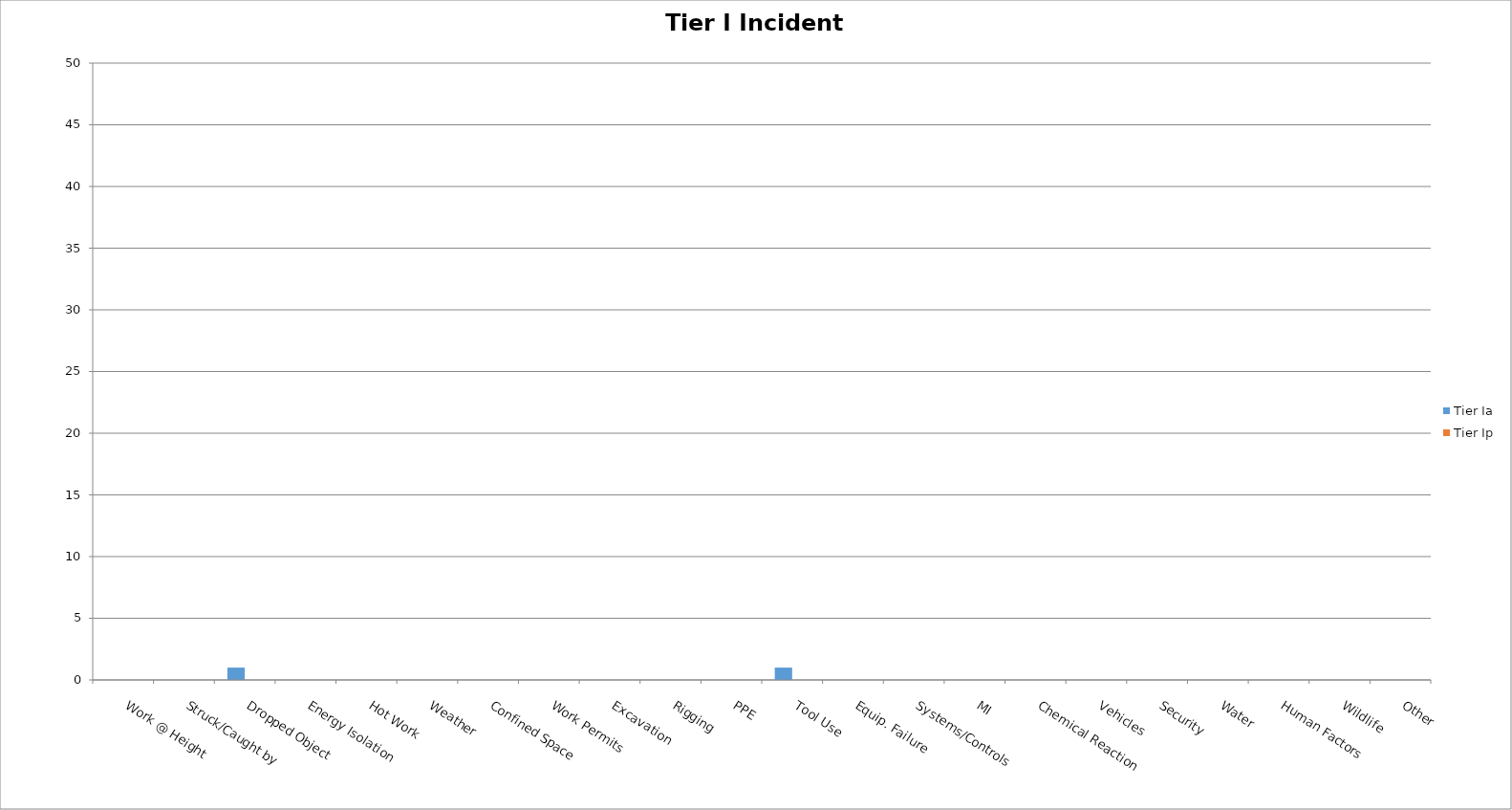
| Category | Tier Ia | Tier Ip |
|---|---|---|
| Work @ Height | 0 | 0 |
| Struck/Caught by | 0 | 0 |
| Dropped Object | 1 | 0 |
| Energy Isolation | 0 | 0 |
| Hot Work | 0 | 0 |
| Weather | 0 | 0 |
| Confined Space | 0 | 0 |
| Work Permits | 0 | 0 |
| Excavation | 0 | 0 |
| Rigging | 0 | 0 |
| PPE | 0 | 0 |
| Tool Use | 1 | 0 |
| Equip. Failure | 0 | 0 |
| Systems/Controls | 0 | 0 |
| MI | 0 | 0 |
| Chemical Reaction | 0 | 0 |
| Vehicles | 0 | 0 |
| Security | 0 | 0 |
| Water | 0 | 0 |
| Human Factors | 0 | 0 |
| Wildlife | 0 | 0 |
| Other | 0 | 0 |